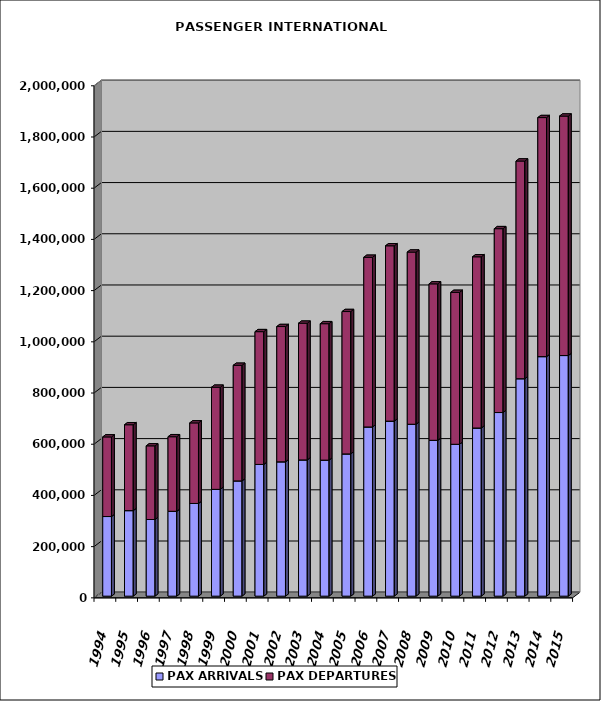
| Category | PAX ARRIVALS | PAX DEPARTURES |
|---|---|---|
| 1994.0 | 311007 | 310979 |
| 1995.0 | 334118 | 335398 |
| 1996.0 | 299346 | 287760 |
| 1997.0 | 331475 | 291214 |
| 1998.0 | 362033 | 314654 |
| 1999.0 | 417136 | 398909 |
| 2000.0 | 450258 | 451452 |
| 2001.0 | 514495 | 518623 |
| 2002.0 | 524740 | 528318 |
| 2003.0 | 532208 | 533904 |
| 2004.0 | 531277 | 532876 |
| 2005.0 | 555647 | 555981 |
| 2006.0 | 660904 | 662652 |
| 2007.0 | 683669 | 684847 |
| 2008.0 | 671477 | 672446 |
| 2009.0 | 608693 | 611086 |
| 2010.0 | 593228 | 593357 |
| 2011.0 | 656791 | 668706 |
| 2012.0 | 717249 | 718064 |
| 2013.0 | 849271 | 850306 |
| 2014.0 | 935615 | 933665 |
| 2015.0 | 939794 | 935299 |